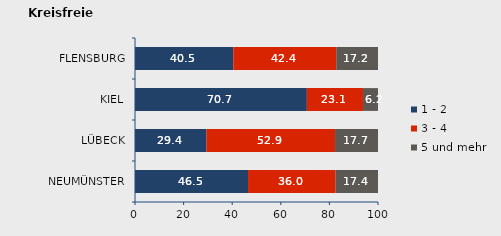
| Category | 1 - 2 | 3 - 4 | 5 und mehr |
|---|---|---|---|
| NEUMÜNSTER | 46.512 | 36.047 | 17.442 |
| LÜBECK | 29.392 | 52.928 | 17.68 |
| KIEL | 70.727 | 23.091 | 6.182 |
| FLENSBURG | 40.458 | 42.366 | 17.176 |